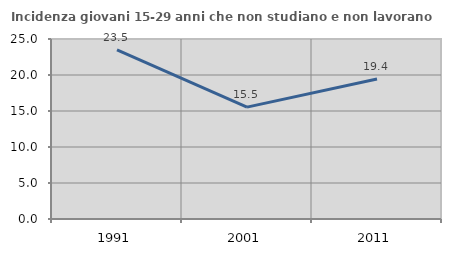
| Category | Incidenza giovani 15-29 anni che non studiano e non lavorano  |
|---|---|
| 1991.0 | 23.488 |
| 2001.0 | 15.538 |
| 2011.0 | 19.445 |